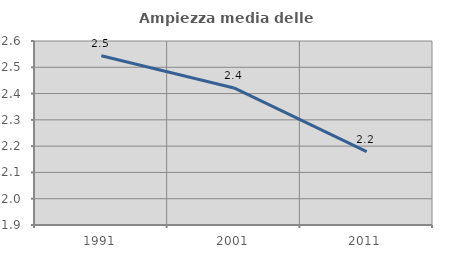
| Category | Ampiezza media delle famiglie |
|---|---|
| 1991.0 | 2.544 |
| 2001.0 | 2.421 |
| 2011.0 | 2.179 |